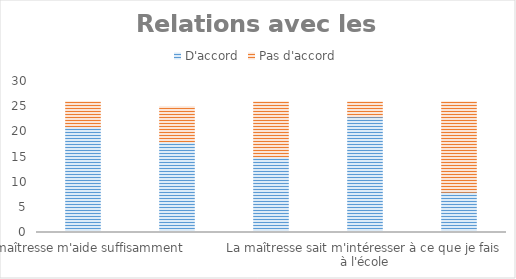
| Category | D'accord | Pas d'accord |
|---|---|---|
| La maîtresse m'aide suffisamment | 21 | 5 |
| La maîtresse me félicite | 18 | 7 |
| J'aimerais que la maîtresse m'explique plus les choses difficiles | 15 | 11 |
| La maîtresse sait m'intéresser à ce que je fais à l'école | 23 | 3 |
| La maîtresse a du mal à faire respecter les règles de la classe | 8 | 18 |